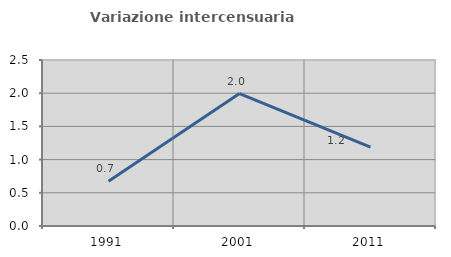
| Category | Variazione intercensuaria annua |
|---|---|
| 1991.0 | 0.674 |
| 2001.0 | 1.994 |
| 2011.0 | 1.188 |